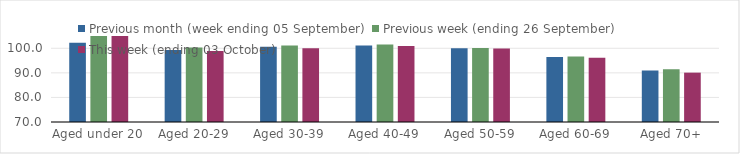
| Category | Previous month (week ending 05 September) | Previous week (ending 26 September) | This week (ending 03 October) |
|---|---|---|---|
| Aged under 20 | 102.25 | 106.08 | 106.19 |
| Aged 20-29 | 99.28 | 100.3 | 98.9 |
| Aged 30-39 | 100.65 | 101.11 | 100.03 |
| Aged 40-49 | 101.09 | 101.49 | 100.92 |
| Aged 50-59 | 100.02 | 100.09 | 99.96 |
| Aged 60-69 | 96.46 | 96.62 | 96.17 |
| Aged 70+ | 90.94 | 91.51 | 90.09 |